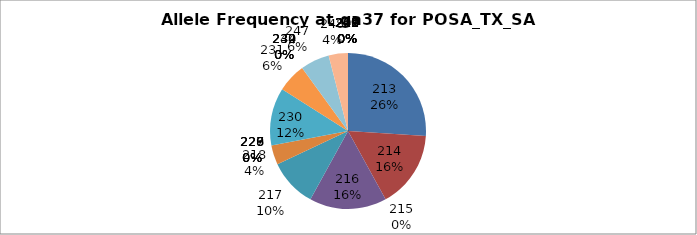
| Category | Series 0 |
|---|---|
| 207.0 | 0 |
| 208.0 | 0 |
| 209.0 | 0 |
| 210.0 | 0 |
| 211.0 | 0 |
| 212.0 | 0 |
| 213.0 | 0.26 |
| 214.0 | 0.16 |
| 215.0 | 0 |
| 216.0 | 0.16 |
| 217.0 | 0.1 |
| 218.0 | 0.04 |
| 226.0 | 0 |
| 227.0 | 0 |
| 228.0 | 0 |
| 229.0 | 0 |
| 230.0 | 0.12 |
| 231.0 | 0.06 |
| 232.0 | 0 |
| 234.0 | 0 |
| 239.0 | 0 |
| 240.0 | 0 |
| 247.0 | 0.06 |
| 248.0 | 0.04 |
| 249.0 | 0 |
| 250.0 | 0 |